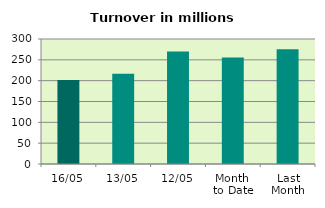
| Category | Series 0 |
|---|---|
| 16/05 | 201.363 |
| 13/05 | 216.396 |
| 12/05 | 269.806 |
| Month 
to Date | 255.786 |
| Last
Month | 275.481 |